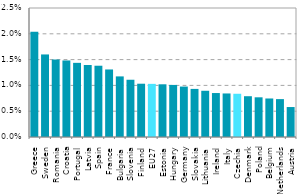
| Category | Series 0 |
|---|---|
| Greece | 0.02 |
| Sweden | 0.016 |
| Romania | 0.015 |
| Croatia | 0.015 |
| Portugal | 0.014 |
| Latvia | 0.014 |
| Spain | 0.014 |
| France | 0.013 |
| Bulgaria | 0.012 |
| Slovenia | 0.011 |
| Finland | 0.01 |
| EU27 | 0.01 |
| Estonia | 0.01 |
| Hungary | 0.01 |
| Germany | 0.01 |
| Slovakia | 0.009 |
| Lithuania | 0.009 |
| Ireland | 0.009 |
| Italy | 0.008 |
| Czechia | 0.008 |
| Denmark | 0.008 |
| Poland | 0.008 |
| Belgium | 0.007 |
| Netherlands | 0.007 |
| Austria | 0.006 |